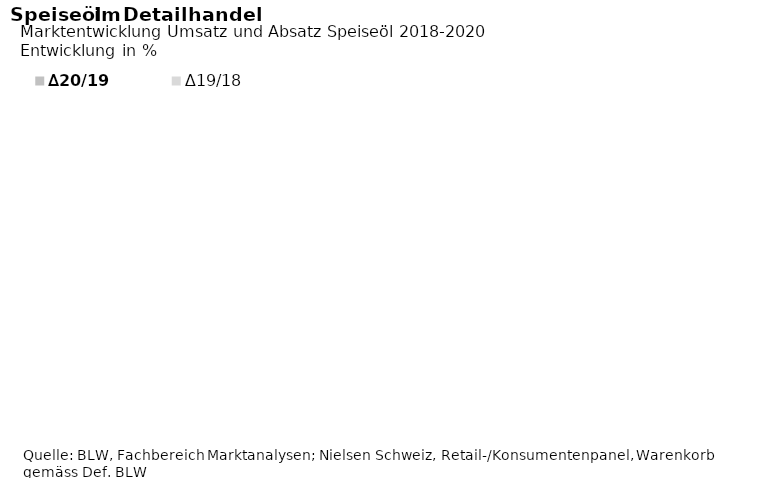
| Category | ∆20/19 | ∆19/18 |
|---|---|---|
| Raps | 8.265 | 1.97 |
| Sonnenblumen | 12.71 | 1.311 |
| Olivenöl | 11.154 | 5.177 |
| Anderes | 8.07 | 0.929 |